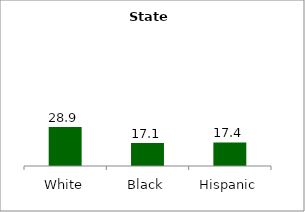
| Category | Series 0 |
|---|---|
| White | 28.86 |
| Black | 17.056 |
| Hispanic | 17.414 |